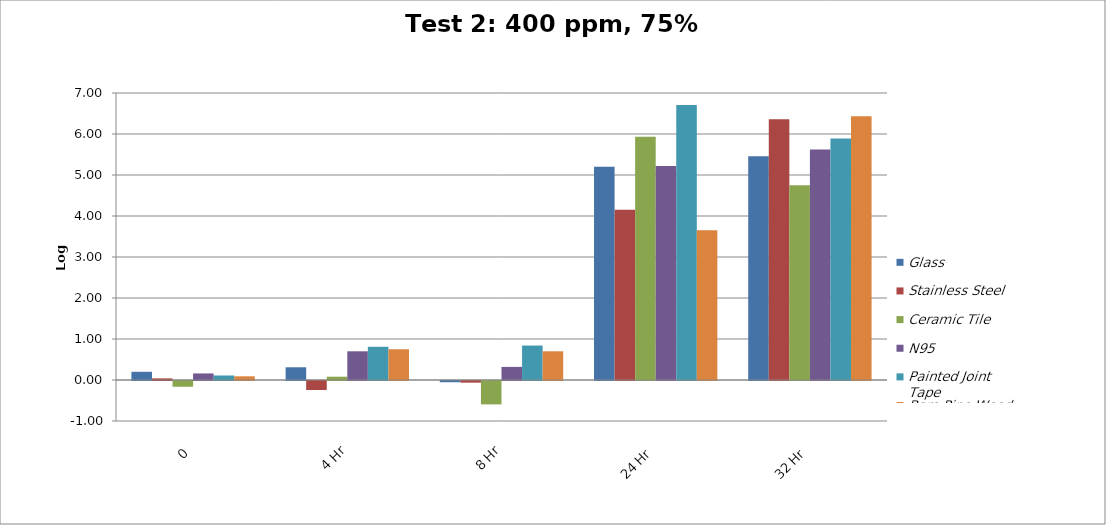
| Category | Glass | Stainless Steel | Ceramic Tile | N95 | Painted Joint Tape | Bare Pine Wood |
|---|---|---|---|---|---|---|
| 0 | 0.2 | 0.04 | -0.14 | 0.16 | 0.11 | 0.09 |
| 4 Hr | 0.31 | -0.22 | 0.08 | 0.7 | 0.81 | 0.75 |
| 8 Hr | -0.03 | -0.04 | -0.57 | 0.32 | 0.84 | 0.7 |
| 24 Hr | 5.2 | 4.15 | 5.93 | 5.22 | 6.71 | 3.65 |
| 32 Hr | 5.46 | 6.36 | 4.75 | 5.62 | 5.89 | 6.43 |